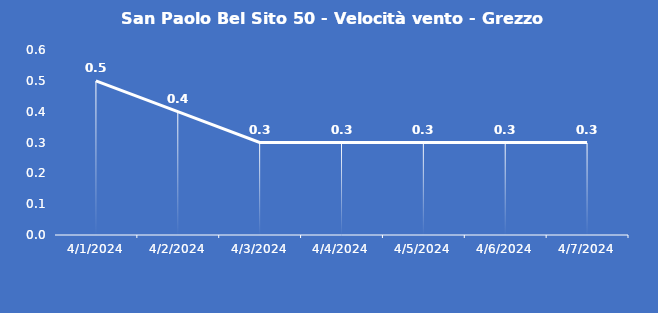
| Category | San Paolo Bel Sito 50 - Velocità vento - Grezzo (m/s) |
|---|---|
| 4/1/24 | 0.5 |
| 4/2/24 | 0.4 |
| 4/3/24 | 0.3 |
| 4/4/24 | 0.3 |
| 4/5/24 | 0.3 |
| 4/6/24 | 0.3 |
| 4/7/24 | 0.3 |